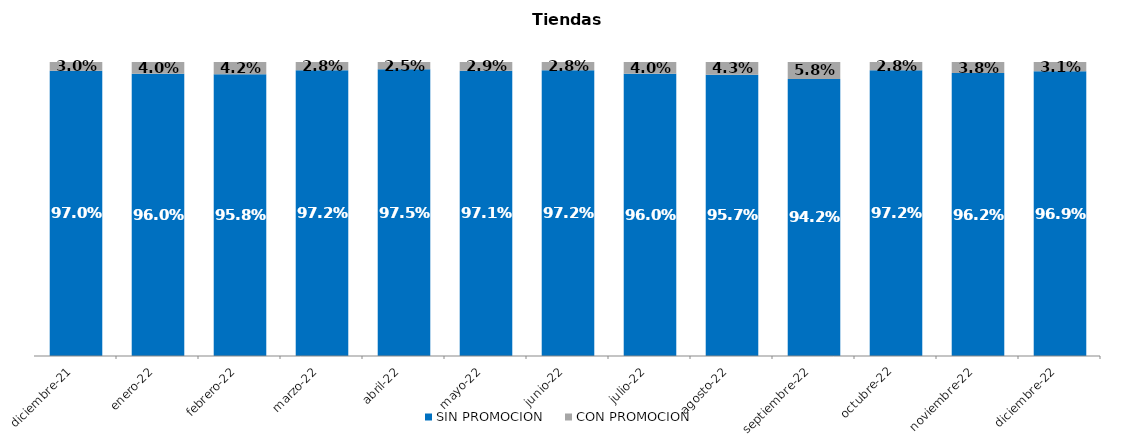
| Category | SIN PROMOCION   | CON PROMOCION   |
|---|---|---|
| 2021-12-01 | 0.97 | 0.03 |
| 2022-01-01 | 0.96 | 0.04 |
| 2022-02-01 | 0.958 | 0.042 |
| 2022-03-01 | 0.972 | 0.028 |
| 2022-04-01 | 0.975 | 0.025 |
| 2022-05-01 | 0.971 | 0.029 |
| 2022-06-01 | 0.972 | 0.028 |
| 2022-07-01 | 0.96 | 0.04 |
| 2022-08-01 | 0.957 | 0.043 |
| 2022-09-01 | 0.942 | 0.058 |
| 2022-10-01 | 0.972 | 0.028 |
| 2022-11-01 | 0.962 | 0.038 |
| 2022-12-01 | 0.969 | 0.031 |